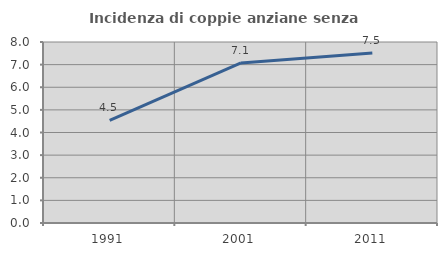
| Category | Incidenza di coppie anziane senza figli  |
|---|---|
| 1991.0 | 4.533 |
| 2001.0 | 7.073 |
| 2011.0 | 7.511 |